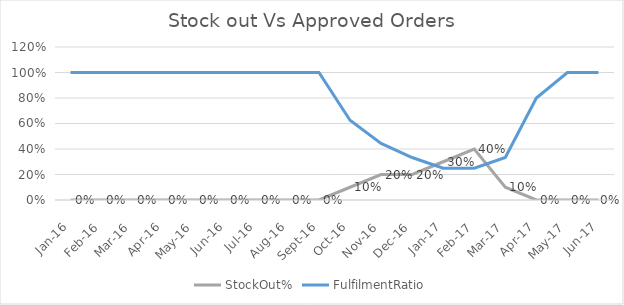
| Category | StockOut% | FulfilmentRatio |
|---|---|---|
| 2016-01-01 | 0 | 1 |
| 2016-02-01 | 0 | 1 |
| 2016-03-01 | 0 | 1 |
| 2016-04-01 | 0 | 1 |
| 2016-05-01 | 0 | 1 |
| 2016-06-01 | 0 | 1 |
| 2016-07-01 | 0 | 1 |
| 2016-08-01 | 0 | 1 |
| 2016-09-01 | 0 | 1 |
| 2016-10-01 | 0.1 | 0.625 |
| 2016-11-01 | 0.2 | 0.444 |
| 2016-12-01 | 0.2 | 0.333 |
| 2017-01-01 | 0.3 | 0.25 |
| 2017-02-01 | 0.4 | 0.25 |
| 2017-03-01 | 0.1 | 0.333 |
| 2017-04-01 | 0 | 0.8 |
| 2017-05-01 | 0 | 1 |
| 2017-06-01 | 0 | 1 |